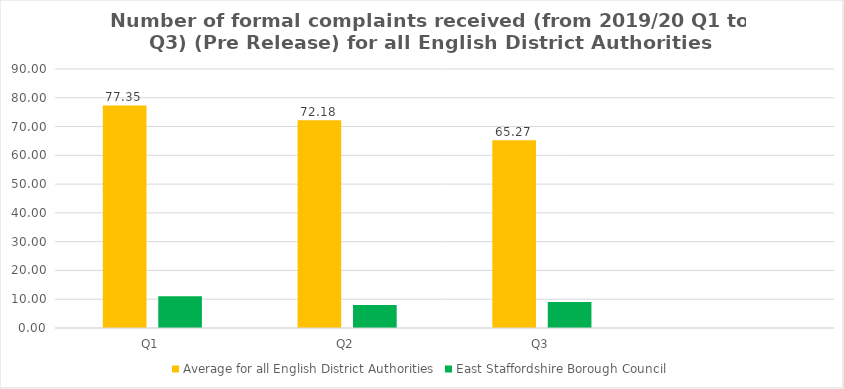
| Category | Average for all English District Authorities | East Staffordshire Borough Council |
|---|---|---|
| Q1 | 77.348 | 11 |
| Q2 | 72.182 | 8 |
| Q3 | 65.27 | 9 |